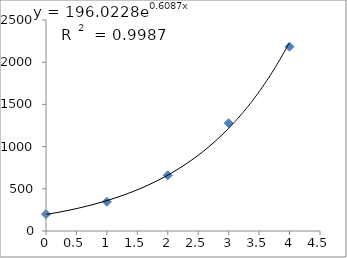
| Category | Series 0 |
|---|---|
| 0.0 | 200 |
| 1.0 | 346 |
| 2.0 | 660 |
| 3.0 | 1277 |
| 4.0 | 2184 |